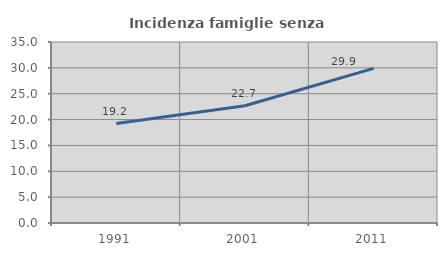
| Category | Incidenza famiglie senza nuclei |
|---|---|
| 1991.0 | 19.219 |
| 2001.0 | 22.663 |
| 2011.0 | 29.894 |